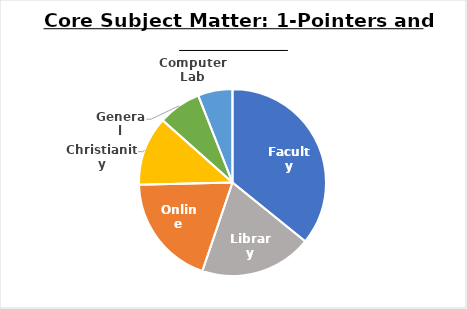
| Category | Count of Core Subject Matter | % |
|---|---|---|
| Faculty | 24 | 0.358 |
| Library | 13 | 0.194 |
| Online | 13 | 0.194 |
| Christianity | 8 | 0.119 |
| General | 5 | 0.075 |
| Computer Lab | 4 | 0.06 |